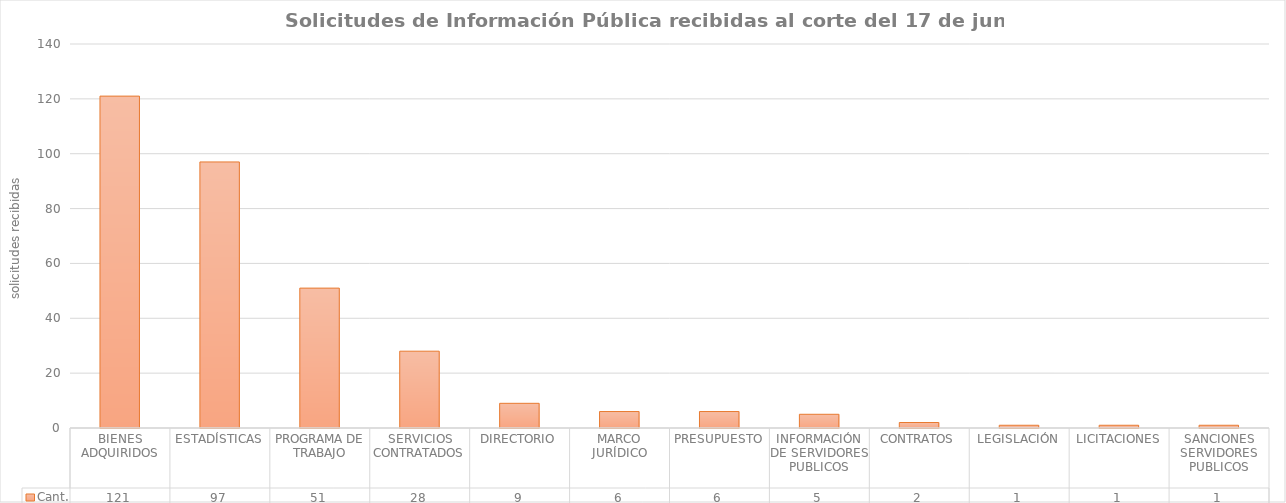
| Category | Cant. |
|---|---|
| BIENES ADQUIRIDOS | 121 |
| ESTADÍSTICAS | 97 |
| PROGRAMA DE TRABAJO | 51 |
| SERVICIOS CONTRATADOS | 28 |
| DIRECTORIO | 9 |
| MARCO JURÍDICO | 6 |
| PRESUPUESTO | 6 |
| INFORMACIÓN DE SERVIDORES PUBLICOS | 5 |
| CONTRATOS | 2 |
| LEGISLACIÓN | 1 |
| LICITACIONES | 1 |
| SANCIONES SERVIDORES PUBLICOS | 1 |